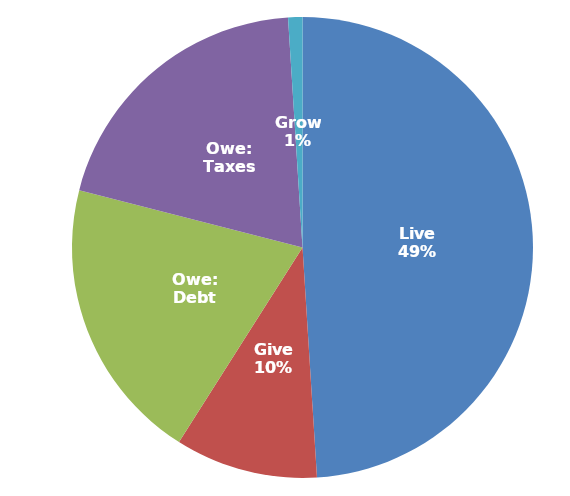
| Category | Series 0 |
|---|---|
| Live | 0.49 |
| Give | 0.1 |
| Owe: Debt | 0.2 |
| Owe: Taxes | 0.2 |
| Grow | 0.01 |